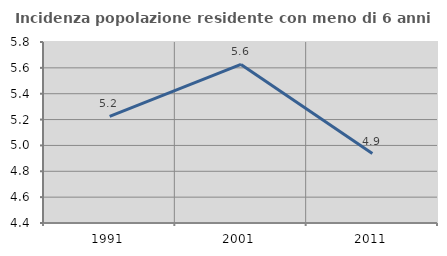
| Category | Incidenza popolazione residente con meno di 6 anni |
|---|---|
| 1991.0 | 5.225 |
| 2001.0 | 5.627 |
| 2011.0 | 4.937 |